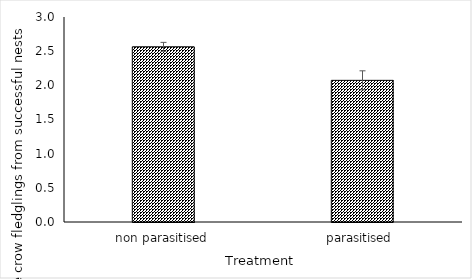
| Category | Series 0 |
|---|---|
| non parasitised | 2.564 |
| parasitised  | 2.073 |